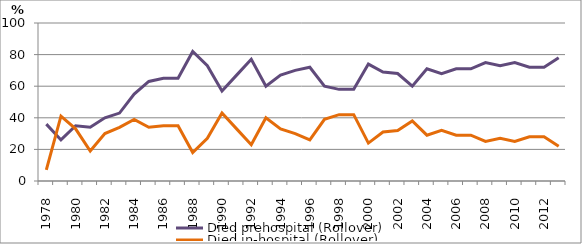
| Category | Died prehospital (Rollover) | Died in-hospital (Rollover) |
|---|---|---|
| 1978.0 | 36 | 7 |
| 1979.0 | 26 | 41 |
| 1980.0 | 35 | 33 |
| 1981.0 | 34 | 19 |
| 1982.0 | 40 | 30 |
| 1983.0 | 43 | 34 |
| 1984.0 | 55 | 39 |
| 1985.0 | 63 | 34 |
| 1986.0 | 65 | 35 |
| 1987.0 | 65 | 35 |
| 1988.0 | 82 | 18 |
| 1989.0 | 73 | 27 |
| 1990.0 | 57 | 43 |
| 1991.0 | 67 | 33 |
| 1992.0 | 77 | 23 |
| 1993.0 | 60 | 40 |
| 1994.0 | 67 | 33 |
| 1995.0 | 70 | 30 |
| 1996.0 | 72 | 26 |
| 1997.0 | 60 | 39 |
| 1998.0 | 58 | 42 |
| 1999.0 | 58 | 42 |
| 2000.0 | 74 | 24 |
| 2001.0 | 69 | 31 |
| 2002.0 | 68 | 32 |
| 2003.0 | 60 | 38 |
| 2004.0 | 71 | 29 |
| 2005.0 | 68 | 32 |
| 2006.0 | 71 | 29 |
| 2007.0 | 71 | 29 |
| 2008.0 | 75 | 25 |
| 2009.0 | 73 | 27 |
| 2010.0 | 75 | 25 |
| 2011.0 | 72 | 28 |
| 2012.0 | 72 | 28 |
| 2013.0 | 78 | 22 |